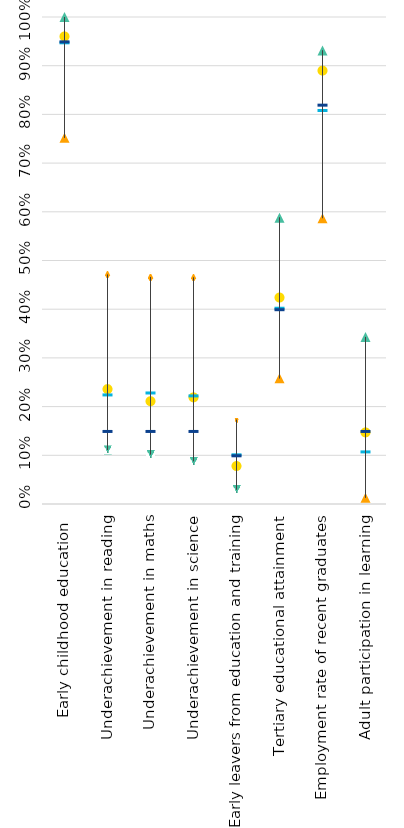
| Category | Austria | Strongest performer | Weakest performer | EU average | EU target |
|---|---|---|---|---|---|
| Early childhood education  | 0.96 | 1 | 0.752 | 0.948 | 0.95 |
| Underachievement in reading | 0.236 | 0.111 | 0.471 | 0.225 | 0.15 |
| Underachievement in maths | 0.211 | 0.102 | 0.466 | 0.229 | 0.15 |
| Underachievement in science | 0.219 | 0.088 | 0.465 | 0.223 | 0.15 |
| Early leavers from education and training | 0.078 | 0.03 | 0.173 | 0.102 | 0.1 |
| Tertiary educational attainment | 0.424 | 0.588 | 0.258 | 0.403 | 0.4 |
| Employment rate of recent graduates | 0.89 | 0.931 | 0.587 | 0.809 | 0.82 |
| Adult participation in learning | 0.147 | 0.343 | 0.013 | 0.108 | 0.15 |